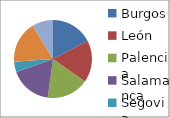
| Category | Series 0 |
|---|---|
| Burgos | 4 |
| León | 4 |
| Palencia | 4 |
| Salamanca | 4 |
| Segovia | 1 |
| Valladolid | 4 |
| Zamora | 2 |